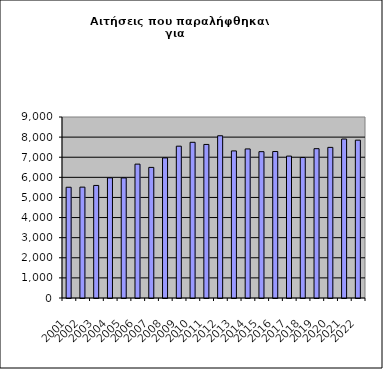
| Category | Series 1 |
|---|---|
| 2001.0 | 5507 |
| 2002.0 | 5513 |
| 2003.0 | 5597 |
| 2004.0 | 5974 |
| 2005.0 | 5970 |
| 2006.0 | 6656 |
| 2007.0 | 6494 |
| 2008.0 | 6966 |
| 2009.0 | 7549 |
| 2010.0 | 7742 |
| 2011.0 | 7635 |
| 2012.0 | 8067 |
| 2013.0 | 7314 |
| 2014.0 | 7412 |
| 2015.0 | 7276 |
| 2016.0 | 7283 |
| 2017.0 | 7056 |
| 2018.0 | 6988 |
| 2019.0 | 7425 |
| 2020.0 | 7489 |
| 2021.0 | 7905 |
| 2022.0 | 7848 |